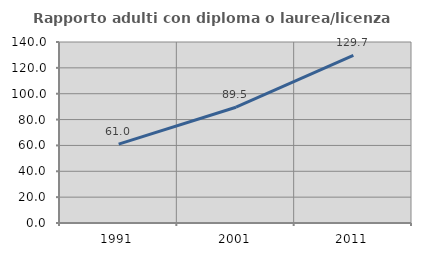
| Category | Rapporto adulti con diploma o laurea/licenza media  |
|---|---|
| 1991.0 | 60.978 |
| 2001.0 | 89.548 |
| 2011.0 | 129.7 |